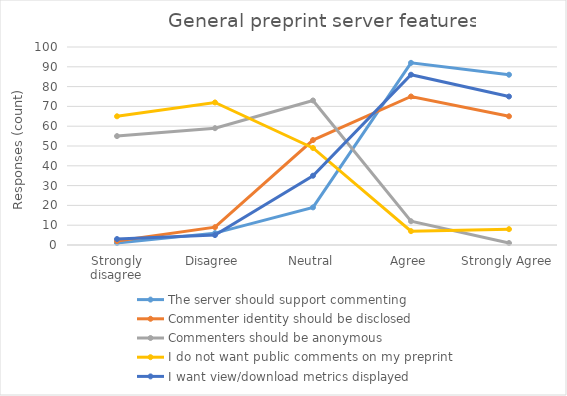
| Category | The server should support commenting | Commenter identity should be disclosed | Commenters should be anonymous | I do not want public comments on my preprint | I want view/download metrics displayed |
|---|---|---|---|---|---|
| Strongly disagree | 1 | 2 | 55 | 65 | 3 |
| Disagree | 6 | 9 | 59 | 72 | 5 |
| Neutral | 19 | 53 | 73 | 49 | 35 |
| Agree | 92 | 75 | 12 | 7 | 86 |
| Strongly Agree | 86 | 65 | 1 | 8 | 75 |